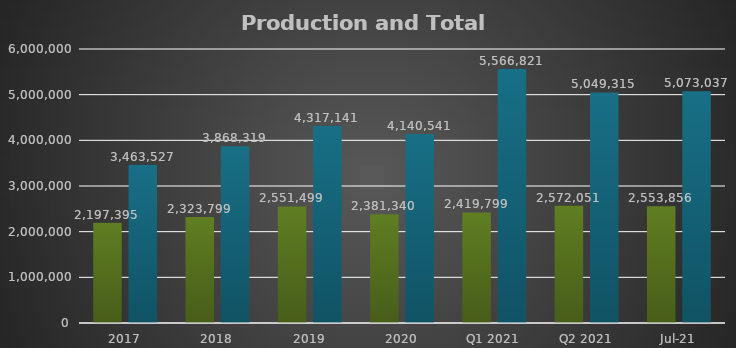
| Category | Production Ha | Total Ha* |
|---|---|---|
| 2017 | 2197395 | 3463527.49 |
| 2018 | 2323798.97 | 3868318.93 |
| 2019 | 2551499 | 4317141 |
| 2020 | 2381340.48 | 4140541.15 |
| Q1 2021 | 2419799 | 5566821.43 |
| Q2 2021 | 2572051 | 5049314.77 |
| Jul-21 | 2553856 | 5073036.67 |